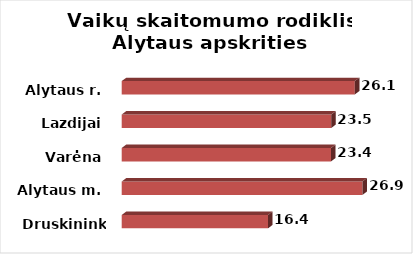
| Category | Series 0 |
|---|---|
| Druskininkai | 16.37 |
| Alytaus m. | 26.94 |
| Varėna | 23.42 |
| Lazdijai | 23.45 |
| Alytaus r. | 26.08 |